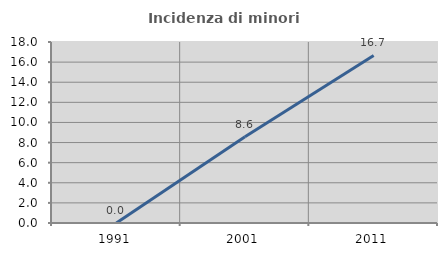
| Category | Incidenza di minori stranieri |
|---|---|
| 1991.0 | 0 |
| 2001.0 | 8.571 |
| 2011.0 | 16.667 |